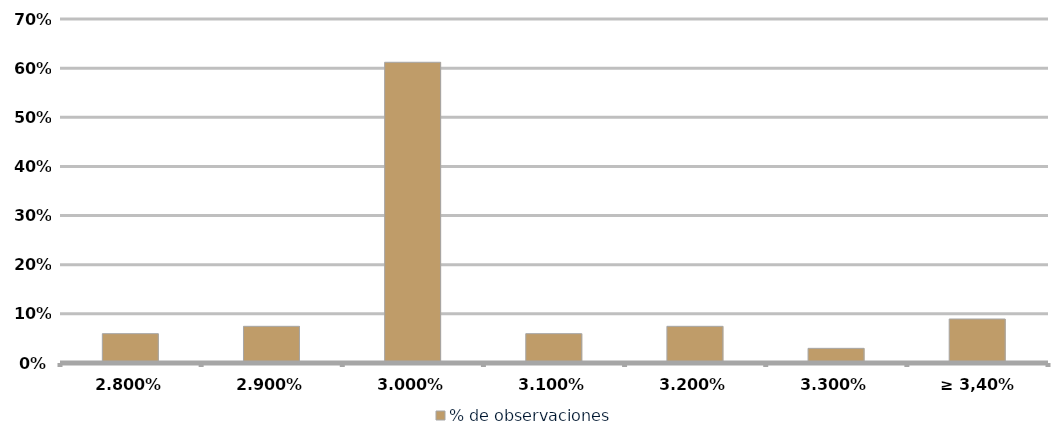
| Category | % de observaciones  |
|---|---|
| 2,80% | 0.06 |
| 2,90% | 0.075 |
| 3,00% | 0.612 |
| 3,10% | 0.06 |
| 3,20% | 0.075 |
| 3,30% | 0.03 |
| ≥ 3,40% | 0.09 |